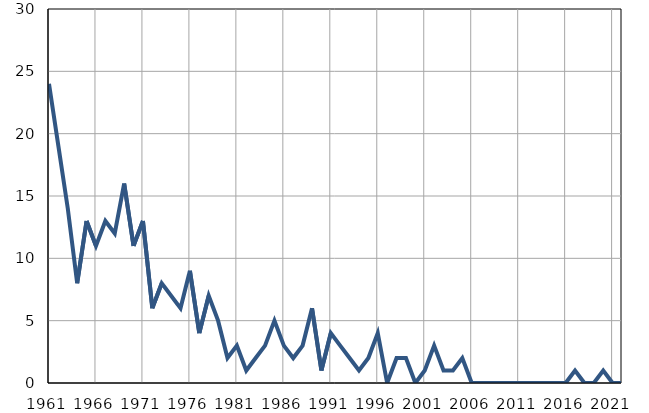
| Category | Умрла 
одојчад |
|---|---|
| 1961.0 | 24 |
| 1962.0 | 19 |
| 1963.0 | 14 |
| 1964.0 | 8 |
| 1965.0 | 13 |
| 1966.0 | 11 |
| 1967.0 | 13 |
| 1968.0 | 12 |
| 1969.0 | 16 |
| 1970.0 | 11 |
| 1971.0 | 13 |
| 1972.0 | 6 |
| 1973.0 | 8 |
| 1974.0 | 7 |
| 1975.0 | 6 |
| 1976.0 | 9 |
| 1977.0 | 4 |
| 1978.0 | 7 |
| 1979.0 | 5 |
| 1980.0 | 2 |
| 1981.0 | 3 |
| 1982.0 | 1 |
| 1983.0 | 2 |
| 1984.0 | 3 |
| 1985.0 | 5 |
| 1986.0 | 3 |
| 1987.0 | 2 |
| 1988.0 | 3 |
| 1989.0 | 6 |
| 1990.0 | 1 |
| 1991.0 | 4 |
| 1992.0 | 3 |
| 1993.0 | 2 |
| 1994.0 | 1 |
| 1995.0 | 2 |
| 1996.0 | 4 |
| 1997.0 | 0 |
| 1998.0 | 2 |
| 1999.0 | 2 |
| 2000.0 | 0 |
| 2001.0 | 1 |
| 2002.0 | 3 |
| 2003.0 | 1 |
| 2004.0 | 1 |
| 2005.0 | 2 |
| 2006.0 | 0 |
| 2007.0 | 0 |
| 2008.0 | 0 |
| 2009.0 | 0 |
| 2010.0 | 0 |
| 2011.0 | 0 |
| 2012.0 | 0 |
| 2013.0 | 0 |
| 2014.0 | 0 |
| 2015.0 | 0 |
| 2016.0 | 0 |
| 2017.0 | 1 |
| 2018.0 | 0 |
| 2019.0 | 0 |
| 2020.0 | 1 |
| 2021.0 | 0 |
| 2022.0 | 0 |